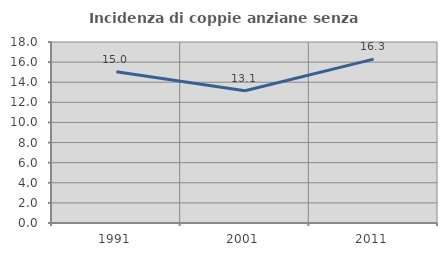
| Category | Incidenza di coppie anziane senza figli  |
|---|---|
| 1991.0 | 15.033 |
| 2001.0 | 13.149 |
| 2011.0 | 16.296 |